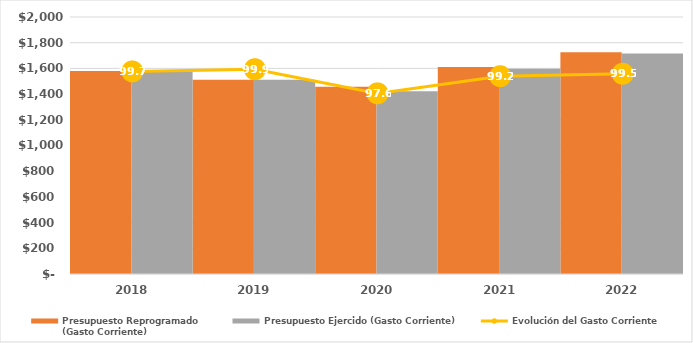
| Category | Presupuesto Reprogramado
(Gasto Corriente) | Presupuesto Ejercido (Gasto Corriente) |
|---|---|---|
| 2018.0 | 1579519.281 | 1574833.44 |
| 2019.0 | 1512199.053 | 1510986.557 |
| 2020.0 | 1457643.367 | 1422248.821 |
| 2021.0 | 1609932.387 | 1597687.431 |
| 2022.0 | 1725174.252 | 1716208.933 |